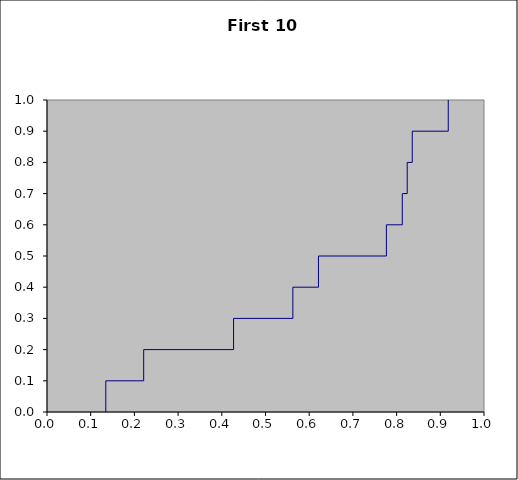
| Category | Series 0 |
|---|---|
| 0.13455305386940608 | 0 |
| 0.13455305386940608 | 0.1 |
| 0.22124137839260483 | 0.1 |
| 0.22124137839260483 | 0.2 |
| 0.4269480113402916 | 0.2 |
| 0.4269480113402916 | 0.3 |
| 0.5626280067760266 | 0.3 |
| 0.5626280067760266 | 0.4 |
| 0.6212044414760152 | 0.4 |
| 0.6212044414760152 | 0.5 |
| 0.7766462401101253 | 0.5 |
| 0.7766462401101253 | 0.6 |
| 0.8130650416595592 | 0.6 |
| 0.8130650416595592 | 0.7 |
| 0.8242858136484837 | 0.7 |
| 0.8242858136484837 | 0.8 |
| 0.8358142915470234 | 0.8 |
| 0.8358142915470234 | 0.9 |
| 0.9182228595021318 | 0.9 |
| 0.9182228595021318 | 1 |